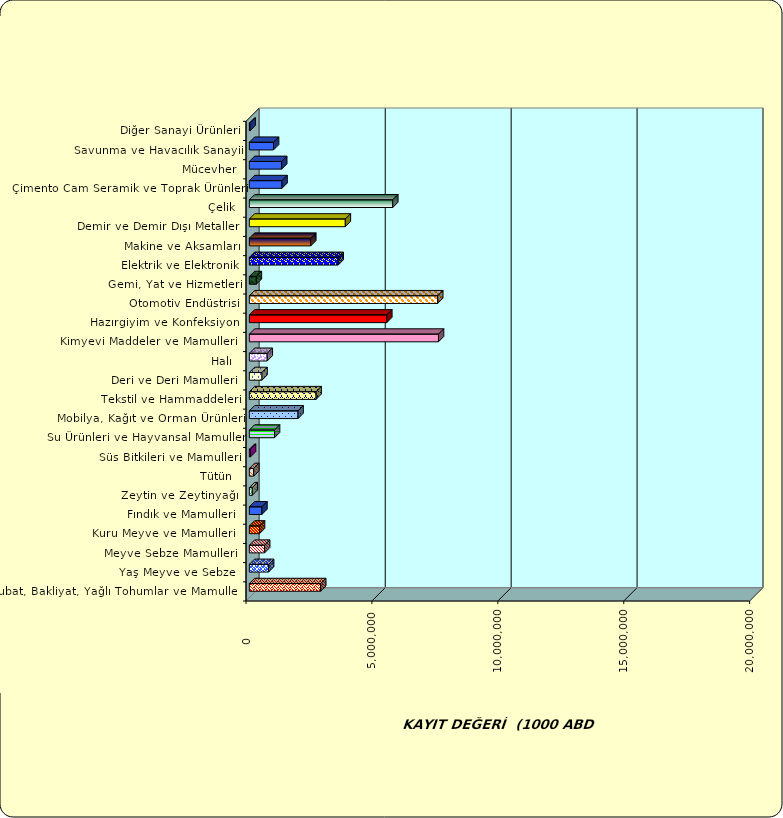
| Category | Series 0 |
|---|---|
|  Hububat, Bakliyat, Yağlı Tohumlar ve Mamulleri  | 2833293.638 |
|  Yaş Meyve ve Sebze   | 764286.651 |
|  Meyve Sebze Mamulleri  | 606450.236 |
|  Kuru Meyve ve Mamulleri   | 403251.3 |
|  Fındık ve Mamulleri  | 498213.593 |
|  Zeytin ve Zeytinyağı  | 116455.799 |
|  Tütün  | 174412.851 |
|  Süs Bitkileri ve Mamulleri | 45176.384 |
|  Su Ürünleri ve Hayvansal Mamuller | 999698.569 |
|  Mobilya, Kağıt ve Orman Ürünleri | 1933279.052 |
|  Tekstil ve Hammaddeleri | 2650159.592 |
|  Deri ve Deri Mamulleri  | 502962.491 |
|  Halı  | 709930.704 |
|  Kimyevi Maddeler ve Mamulleri   | 7510792.094 |
|  Hazırgiyim ve Konfeksiyon  | 5458185.394 |
|  Otomotiv Endüstrisi | 7478605.018 |
|  Gemi, Yat ve Hizmetleri | 278083.293 |
|  Elektrik ve Elektronik | 3528080.473 |
|  Makine ve Aksamları | 2439289.259 |
|  Demir ve Demir Dışı Metaller  | 3810750.662 |
|  Çelik | 5694823.006 |
|  Çimento Cam Seramik ve Toprak Ürünleri | 1297316.215 |
|  Mücevher | 1283667.555 |
|  Savunma ve Havacılık Sanayii | 961072.539 |
|  Diğer Sanayi Ürünleri | 29699.019 |